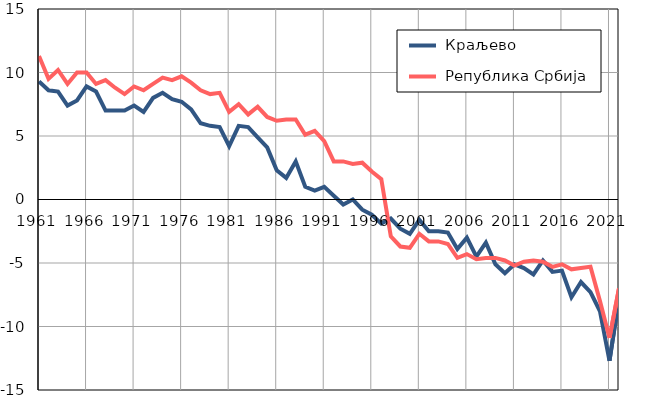
| Category |  Краљево |  Република Србија |
|---|---|---|
| 1961.0 | 9.3 | 11.3 |
| 1962.0 | 8.6 | 9.5 |
| 1963.0 | 8.5 | 10.2 |
| 1964.0 | 7.4 | 9.1 |
| 1965.0 | 7.8 | 10 |
| 1966.0 | 8.9 | 10 |
| 1967.0 | 8.5 | 9.1 |
| 1968.0 | 7 | 9.4 |
| 1969.0 | 7 | 8.8 |
| 1970.0 | 7 | 8.3 |
| 1971.0 | 7.4 | 8.9 |
| 1972.0 | 6.9 | 8.6 |
| 1973.0 | 8 | 9.1 |
| 1974.0 | 8.4 | 9.6 |
| 1975.0 | 7.9 | 9.4 |
| 1976.0 | 7.7 | 9.7 |
| 1977.0 | 7.1 | 9.2 |
| 1978.0 | 6 | 8.6 |
| 1979.0 | 5.8 | 8.3 |
| 1980.0 | 5.7 | 8.4 |
| 1981.0 | 4.2 | 6.9 |
| 1982.0 | 5.8 | 7.5 |
| 1983.0 | 5.7 | 6.7 |
| 1984.0 | 4.9 | 7.3 |
| 1985.0 | 4.1 | 6.5 |
| 1986.0 | 2.3 | 6.2 |
| 1987.0 | 1.7 | 6.3 |
| 1988.0 | 3 | 6.3 |
| 1989.0 | 1 | 5.1 |
| 1990.0 | 0.7 | 5.4 |
| 1991.0 | 1 | 4.6 |
| 1992.0 | 0.3 | 3 |
| 1993.0 | -0.4 | 3 |
| 1994.0 | 0 | 2.8 |
| 1995.0 | -0.8 | 2.9 |
| 1996.0 | -1.2 | 2.2 |
| 1997.0 | -1.9 | 1.6 |
| 1998.0 | -1.5 | -2.9 |
| 1999.0 | -2.3 | -3.7 |
| 2000.0 | -2.7 | -3.8 |
| 2001.0 | -1.6 | -2.7 |
| 2002.0 | -2.5 | -3.3 |
| 2003.0 | -2.5 | -3.3 |
| 2004.0 | -2.6 | -3.5 |
| 2005.0 | -3.9 | -4.6 |
| 2006.0 | -3 | -4.3 |
| 2007.0 | -4.5 | -4.7 |
| 2008.0 | -3.4 | -4.6 |
| 2009.0 | -5.1 | -4.6 |
| 2010.0 | -5.8 | -4.8 |
| 2011.0 | -5.1 | -5.2 |
| 2012.0 | -5.4 | -4.9 |
| 2013.0 | -5.9 | -4.8 |
| 2014.0 | -4.8 | -4.9 |
| 2015.0 | -5.7 | -5.3 |
| 2016.0 | -5.6 | -5.1 |
| 2017.0 | -7.7 | -5.5 |
| 2018.0 | -6.5 | -5.4 |
| 2019.0 | -7.3 | -5.3 |
| 2020.0 | -8.8 | -8 |
| 2021.0 | -12.7 | -10.9 |
| 2022.0 | -7.8 | -7 |